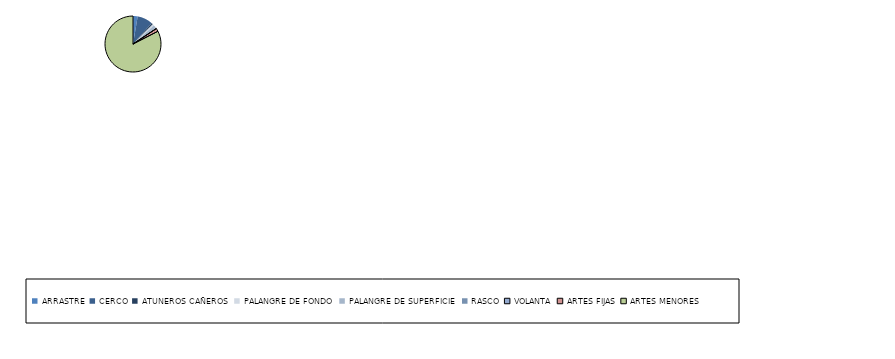
| Category | Series 0 |
|---|---|
| ARRASTRE | 6 |
| CERCO | 20 |
| ATUNEROS CAÑEROS | 2 |
| PALANGRE DE FONDO | 2 |
| PALANGRE DE SUPERFICIE | 4 |
| RASCO | 1 |
| VOLANTA | 0 |
| ARTES FIJAS | 4 |
| ARTES MENORES | 184 |